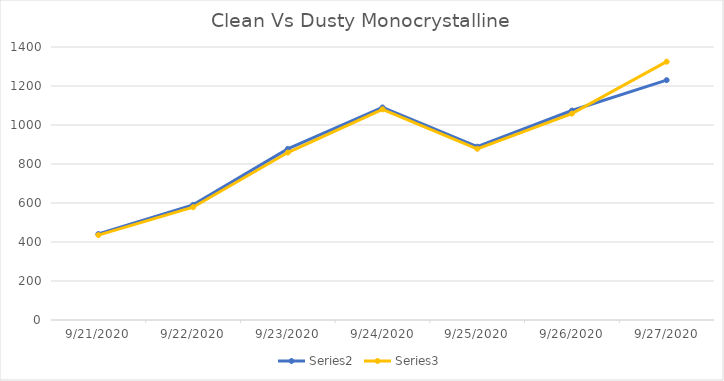
| Category | Series 0 | Series 1 | Series 2 |
|---|---|---|---|
| 9/21/20 |  | 441 | 435.5 |
| 9/22/20 |  | 590.5 | 578.5 |
| 9/23/20 |  | 877.5 | 858.75 |
| 9/24/20 |  | 1090 | 1080.5 |
| 9/25/20 |  | 888.75 | 878 |
| 9/26/20 |  | 1074.25 | 1058.25 |
| 9/27/20 |  | 1230 | 1324.75 |